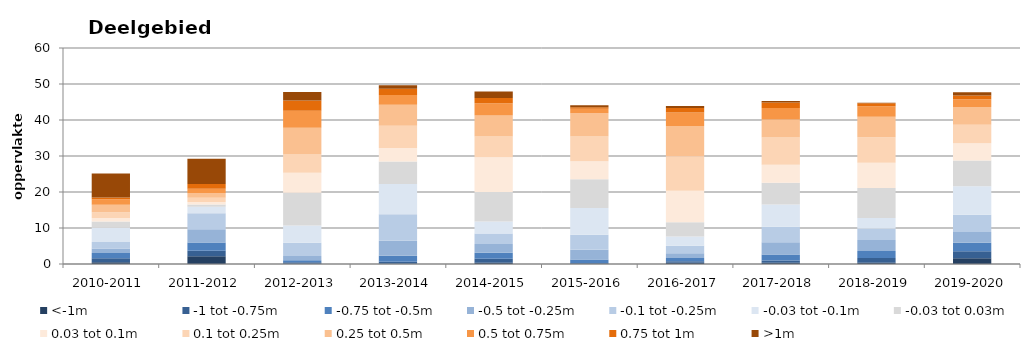
| Category | <-1m | -1 tot -0.75m | -0.75 tot -0.5m | -0.5 tot -0.25m | -0.1 tot -0.25m | -0.03 tot -0.1m | -0.03 tot 0.03m | 0.03 tot 0.1m | 0.1 tot 0.25m | 0.25 tot 0.5m | 0.5 tot 0.75m | 0.75 tot 1m | >1m |
|---|---|---|---|---|---|---|---|---|---|---|---|---|---|
| 2010-2011 | 0.518 | 1.094 | 1.465 | 1.24 | 1.779 | 3.943 | 1.744 | 0.985 | 1.59 | 2.077 | 1.548 | 0.521 | 6.643 |
| 2011-2012 | 2.144 | 1.56 | 2.278 | 3.643 | 4.462 | 1.814 | 0.634 | 0.698 | 1.141 | 1.296 | 1.211 | 1.312 | 7.052 |
| 2012-2013 | 0.086 | 0.369 | 0.596 | 1.164 | 3.702 | 4.795 | 9.078 | 5.559 | 5.062 | 7.442 | 4.75 | 2.793 | 2.386 |
| 2013-2014 | 0.086 | 0.529 | 1.684 | 4.143 | 7.403 | 8.368 | 6.276 | 3.703 | 6.194 | 5.833 | 2.732 | 1.698 | 1.036 |
| 2014-2015 | 0.336 | 1.125 | 1.65 | 2.415 | 2.93 | 3.345 | 8.19 | 9.636 | 5.796 | 5.841 | 3.361 | 1.466 | 1.792 |
| 2015-2016 | 0.086 | 0.224 | 0.945 | 2.727 | 4.11 | 7.49 | 7.928 | 5.044 | 6.837 | 6.489 | 1.228 | 0.455 | 0.51 |
| 2016-2017 | 0.374 | 0.397 | 0.886 | 1.342 | 2.105 | 2.553 | 3.966 | 8.744 | 9.587 | 8.362 | 3.737 | 1.296 | 0.548 |
| 2017-2018 | 0.336 | 0.637 | 1.66 | 3.394 | 4.352 | 6.134 | 6.034 | 5.029 | 7.577 | 4.96 | 3.186 | 1.557 | 0.411 |
| 2018-2019 | 0.323 | 1.342 | 1.934 | 3.097 | 3.163 | 2.896 | 8.367 | 7.009 | 7.11 | 5.638 | 2.964 | 0.784 | 0.199 |
| 2019-2020 | 1.572 | 1.979 | 2.321 | 3.042 | 4.738 | 7.948 | 7.146 | 4.77 | 5.184 | 4.886 | 2.175 | 1.068 | 0.849 |